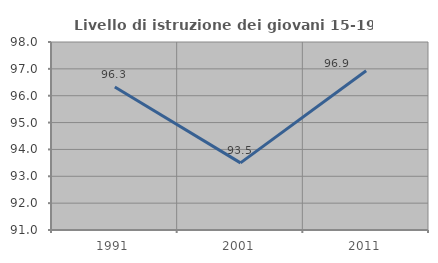
| Category | Livello di istruzione dei giovani 15-19 anni |
|---|---|
| 1991.0 | 96.327 |
| 2001.0 | 93.5 |
| 2011.0 | 96.933 |